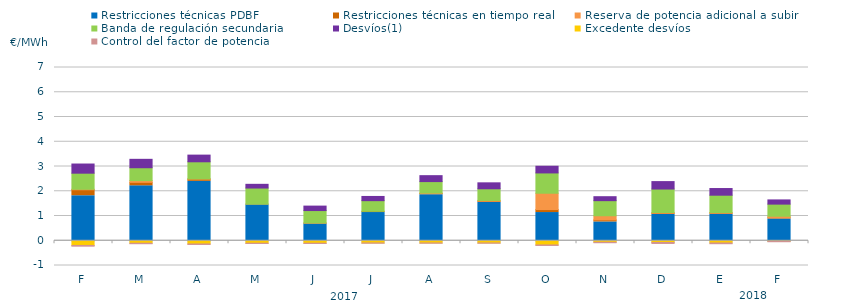
| Category | Restricciones técnicas PDBF | Restricciones técnicas en tiempo real | Reserva de potencia adicional a subir | Banda de regulación secundaria | Desvíos(1) | Excedente desvíos | Control del factor de potencia |
|---|---|---|---|---|---|---|---|
| F | 1.82 | 0.24 | 0.02 | 0.65 | 0.37 | -0.19 | -0.07 |
| M | 2.22 | 0.14 | 0.07 | 0.52 | 0.34 | -0.1 | -0.06 |
| A | 2.4 | 0.09 | 0.01 | 0.69 | 0.27 | -0.13 | -0.06 |
| M | 1.45 | 0.03 | 0 | 0.65 | 0.15 | -0.1 | -0.05 |
| J | 0.69 | 0.02 | 0.01 | 0.5 | 0.18 | -0.1 | -0.05 |
| J | 1.14 | 0.05 | 0 | 0.43 | 0.17 | -0.09 | -0.05 |
| A | 1.86 | 0.05 | 0.02 | 0.46 | 0.24 | -0.09 | -0.05 |
| S | 1.55 | 0.05 | 0.03 | 0.47 | 0.24 | -0.09 | -0.05 |
| O | 1.14 | 0.12 | 0.66 | 0.82 | 0.27 | -0.17 | -0.06 |
| N | 0.76 | 0.08 | 0.17 | 0.61 | 0.16 | -0.06 | -0.06 |
| D | 1.06 | 0.05 | 0.03 | 0.95 | 0.3 | -0.07 | -0.08 |
| E | 1.07 | 0.05 | 0.02 | 0.7 | 0.27 | -0.09 | -0.07 |
| F | 0.88 | 0.05 | 0.06 | 0.49 | 0.17 | -0.02 | -0.06 |